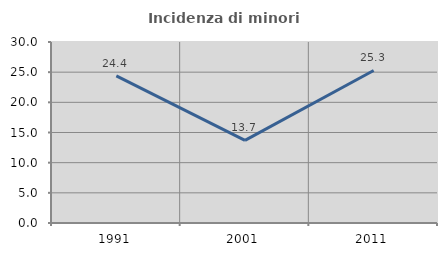
| Category | Incidenza di minori stranieri |
|---|---|
| 1991.0 | 24.39 |
| 2001.0 | 13.699 |
| 2011.0 | 25.279 |